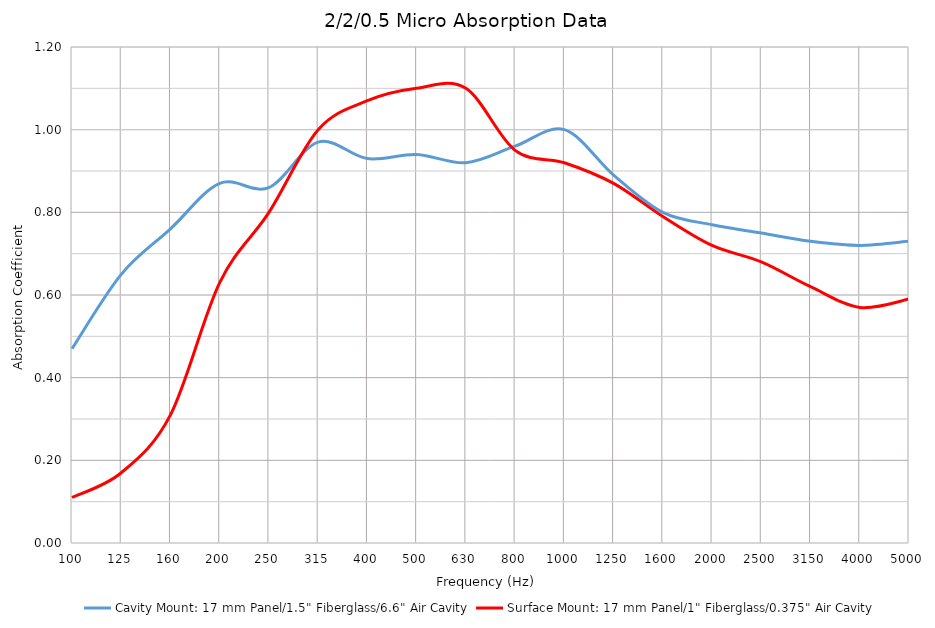
| Category | Cavity Mount: 17 mm Panel/1.5" Fiberglass/6.6" Air Cavity | Surface Mount: 17 mm Panel/1" Fiberglass/0.375" Air Cavity |
|---|---|---|
| 100.0 | 0.47 | 0.11 |
| 125.0 | 0.65 | 0.17 |
| 160.0 | 0.76 | 0.31 |
| 200.0 | 0.87 | 0.63 |
| 250.0 | 0.86 | 0.8 |
| 315.0 | 0.97 | 1 |
| 400.0 | 0.93 | 1.07 |
| 500.0 | 0.94 | 1.1 |
| 630.0 | 0.92 | 1.1 |
| 800.0 | 0.96 | 0.95 |
| 1000.0 | 1 | 0.92 |
| 1250.0 | 0.89 | 0.87 |
| 1600.0 | 0.8 | 0.79 |
| 2000.0 | 0.77 | 0.72 |
| 2500.0 | 0.75 | 0.68 |
| 3150.0 | 0.73 | 0.62 |
| 4000.0 | 0.72 | 0.57 |
| 5000.0 | 0.73 | 0.59 |